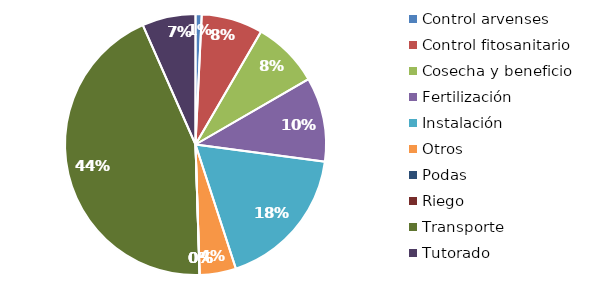
| Category | Valor |
|---|---|
| Control arvenses | 248964 |
| Control fitosanitario | 2474550 |
| Cosecha y beneficio | 2693186.999 |
| Fertilización | 3398461 |
| Instalación | 5822326.437 |
| Otros | 1464395 |
| Podas | 0 |
| Riego | 0 |
| Transporte | 14275020 |
| Tutorado | 2154600 |